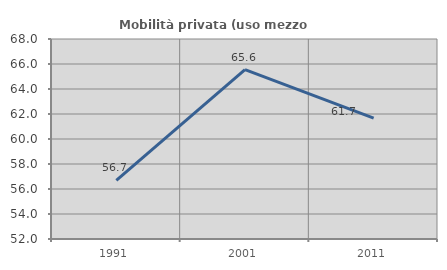
| Category | Mobilità privata (uso mezzo privato) |
|---|---|
| 1991.0 | 56.699 |
| 2001.0 | 65.553 |
| 2011.0 | 61.663 |